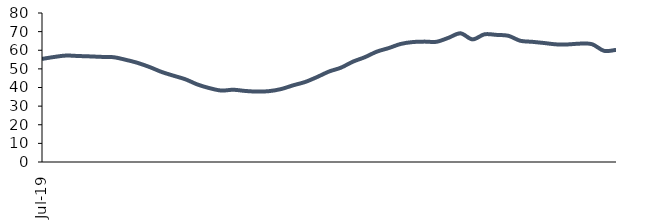
| Category | Series 0 |
|---|---|
| 2019-07-01 | 55.345 |
| 2019-08-01 | 56.375 |
| 2019-09-01 | 57.152 |
| 2019-10-01 | 56.913 |
| 2019-11-01 | 56.704 |
| 2019-12-01 | 56.434 |
| 2020-01-01 | 56.256 |
| 2020-02-01 | 54.873 |
| 2020-03-01 | 53.212 |
| 2020-04-01 | 50.982 |
| 2020-05-01 | 48.355 |
| 2020-06-01 | 46.331 |
| 2020-07-01 | 44.38 |
| 2020-08-01 | 41.619 |
| 2020-09-01 | 39.667 |
| 2020-10-01 | 38.362 |
| 2020-11-01 | 38.792 |
| 2020-12-01 | 38.145 |
| 2021-01-01 | 37.796 |
| 2021-02-01 | 38.055 |
| 2021-03-01 | 39.169 |
| 2021-04-01 | 41.169 |
| 2021-05-01 | 42.952 |
| 2021-06-01 | 45.61 |
| 2021-07-01 | 48.568 |
| 2021-08-01 | 50.651 |
| 2021-09-01 | 53.87 |
| 2021-10-01 | 56.277 |
| 2021-11-01 | 59.262 |
| 2021-12-01 | 61.182 |
| 2022-01-01 | 63.387 |
| 2022-02-01 | 64.392 |
| 2022-03-01 | 64.636 |
| 2022-04-01 | 64.553 |
| 2022-05-01 | 66.706 |
| 2022-06-01 | 69.09 |
| 2022-07-01 | 65.835 |
| 2022-08-01 | 68.552 |
| 2022-09-01 | 68.253 |
| 2022-10-01 | 67.758 |
| 2022-11-01 | 65.088 |
| 2022-12-01 | 64.531 |
| 2023-01-01 | 63.88 |
| 2023-02-01 | 63.159 |
| 2023-03-01 | 63.145 |
| 2023-04-01 | 63.558 |
| 2023-05-01 | 63.246 |
| 2023-06-01 | 59.697 |
| 2023-07-01 | 60.197 |